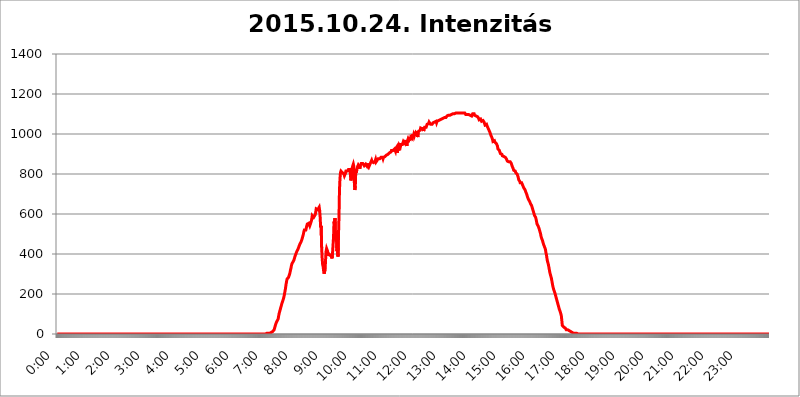
| Category | 2015.10.24. Intenzitás [W/m^2] |
|---|---|
| 0.0 | 0 |
| 0.0006944444444444445 | 0 |
| 0.001388888888888889 | 0 |
| 0.0020833333333333333 | 0 |
| 0.002777777777777778 | 0 |
| 0.003472222222222222 | 0 |
| 0.004166666666666667 | 0 |
| 0.004861111111111111 | 0 |
| 0.005555555555555556 | 0 |
| 0.0062499999999999995 | 0 |
| 0.006944444444444444 | 0 |
| 0.007638888888888889 | 0 |
| 0.008333333333333333 | 0 |
| 0.009027777777777779 | 0 |
| 0.009722222222222222 | 0 |
| 0.010416666666666666 | 0 |
| 0.011111111111111112 | 0 |
| 0.011805555555555555 | 0 |
| 0.012499999999999999 | 0 |
| 0.013194444444444444 | 0 |
| 0.013888888888888888 | 0 |
| 0.014583333333333332 | 0 |
| 0.015277777777777777 | 0 |
| 0.015972222222222224 | 0 |
| 0.016666666666666666 | 0 |
| 0.017361111111111112 | 0 |
| 0.018055555555555557 | 0 |
| 0.01875 | 0 |
| 0.019444444444444445 | 0 |
| 0.02013888888888889 | 0 |
| 0.020833333333333332 | 0 |
| 0.02152777777777778 | 0 |
| 0.022222222222222223 | 0 |
| 0.02291666666666667 | 0 |
| 0.02361111111111111 | 0 |
| 0.024305555555555556 | 0 |
| 0.024999999999999998 | 0 |
| 0.025694444444444447 | 0 |
| 0.02638888888888889 | 0 |
| 0.027083333333333334 | 0 |
| 0.027777777777777776 | 0 |
| 0.02847222222222222 | 0 |
| 0.029166666666666664 | 0 |
| 0.029861111111111113 | 0 |
| 0.030555555555555555 | 0 |
| 0.03125 | 0 |
| 0.03194444444444445 | 0 |
| 0.03263888888888889 | 0 |
| 0.03333333333333333 | 0 |
| 0.034027777777777775 | 0 |
| 0.034722222222222224 | 0 |
| 0.035416666666666666 | 0 |
| 0.036111111111111115 | 0 |
| 0.03680555555555556 | 0 |
| 0.0375 | 0 |
| 0.03819444444444444 | 0 |
| 0.03888888888888889 | 0 |
| 0.03958333333333333 | 0 |
| 0.04027777777777778 | 0 |
| 0.04097222222222222 | 0 |
| 0.041666666666666664 | 0 |
| 0.042361111111111106 | 0 |
| 0.04305555555555556 | 0 |
| 0.043750000000000004 | 0 |
| 0.044444444444444446 | 0 |
| 0.04513888888888889 | 0 |
| 0.04583333333333334 | 0 |
| 0.04652777777777778 | 0 |
| 0.04722222222222222 | 0 |
| 0.04791666666666666 | 0 |
| 0.04861111111111111 | 0 |
| 0.049305555555555554 | 0 |
| 0.049999999999999996 | 0 |
| 0.05069444444444445 | 0 |
| 0.051388888888888894 | 0 |
| 0.052083333333333336 | 0 |
| 0.05277777777777778 | 0 |
| 0.05347222222222222 | 0 |
| 0.05416666666666667 | 0 |
| 0.05486111111111111 | 0 |
| 0.05555555555555555 | 0 |
| 0.05625 | 0 |
| 0.05694444444444444 | 0 |
| 0.057638888888888885 | 0 |
| 0.05833333333333333 | 0 |
| 0.05902777777777778 | 0 |
| 0.059722222222222225 | 0 |
| 0.06041666666666667 | 0 |
| 0.061111111111111116 | 0 |
| 0.06180555555555556 | 0 |
| 0.0625 | 0 |
| 0.06319444444444444 | 0 |
| 0.06388888888888888 | 0 |
| 0.06458333333333334 | 0 |
| 0.06527777777777778 | 0 |
| 0.06597222222222222 | 0 |
| 0.06666666666666667 | 0 |
| 0.06736111111111111 | 0 |
| 0.06805555555555555 | 0 |
| 0.06874999999999999 | 0 |
| 0.06944444444444443 | 0 |
| 0.07013888888888889 | 0 |
| 0.07083333333333333 | 0 |
| 0.07152777777777779 | 0 |
| 0.07222222222222223 | 0 |
| 0.07291666666666667 | 0 |
| 0.07361111111111111 | 0 |
| 0.07430555555555556 | 0 |
| 0.075 | 0 |
| 0.07569444444444444 | 0 |
| 0.0763888888888889 | 0 |
| 0.07708333333333334 | 0 |
| 0.07777777777777778 | 0 |
| 0.07847222222222222 | 0 |
| 0.07916666666666666 | 0 |
| 0.0798611111111111 | 0 |
| 0.08055555555555556 | 0 |
| 0.08125 | 0 |
| 0.08194444444444444 | 0 |
| 0.08263888888888889 | 0 |
| 0.08333333333333333 | 0 |
| 0.08402777777777777 | 0 |
| 0.08472222222222221 | 0 |
| 0.08541666666666665 | 0 |
| 0.08611111111111112 | 0 |
| 0.08680555555555557 | 0 |
| 0.08750000000000001 | 0 |
| 0.08819444444444445 | 0 |
| 0.08888888888888889 | 0 |
| 0.08958333333333333 | 0 |
| 0.09027777777777778 | 0 |
| 0.09097222222222222 | 0 |
| 0.09166666666666667 | 0 |
| 0.09236111111111112 | 0 |
| 0.09305555555555556 | 0 |
| 0.09375 | 0 |
| 0.09444444444444444 | 0 |
| 0.09513888888888888 | 0 |
| 0.09583333333333333 | 0 |
| 0.09652777777777777 | 0 |
| 0.09722222222222222 | 0 |
| 0.09791666666666667 | 0 |
| 0.09861111111111111 | 0 |
| 0.09930555555555555 | 0 |
| 0.09999999999999999 | 0 |
| 0.10069444444444443 | 0 |
| 0.1013888888888889 | 0 |
| 0.10208333333333335 | 0 |
| 0.10277777777777779 | 0 |
| 0.10347222222222223 | 0 |
| 0.10416666666666667 | 0 |
| 0.10486111111111111 | 0 |
| 0.10555555555555556 | 0 |
| 0.10625 | 0 |
| 0.10694444444444444 | 0 |
| 0.1076388888888889 | 0 |
| 0.10833333333333334 | 0 |
| 0.10902777777777778 | 0 |
| 0.10972222222222222 | 0 |
| 0.1111111111111111 | 0 |
| 0.11180555555555556 | 0 |
| 0.11180555555555556 | 0 |
| 0.1125 | 0 |
| 0.11319444444444444 | 0 |
| 0.11388888888888889 | 0 |
| 0.11458333333333333 | 0 |
| 0.11527777777777777 | 0 |
| 0.11597222222222221 | 0 |
| 0.11666666666666665 | 0 |
| 0.1173611111111111 | 0 |
| 0.11805555555555557 | 0 |
| 0.11944444444444445 | 0 |
| 0.12013888888888889 | 0 |
| 0.12083333333333333 | 0 |
| 0.12152777777777778 | 0 |
| 0.12222222222222223 | 0 |
| 0.12291666666666667 | 0 |
| 0.12291666666666667 | 0 |
| 0.12361111111111112 | 0 |
| 0.12430555555555556 | 0 |
| 0.125 | 0 |
| 0.12569444444444444 | 0 |
| 0.12638888888888888 | 0 |
| 0.12708333333333333 | 0 |
| 0.16875 | 0 |
| 0.12847222222222224 | 0 |
| 0.12916666666666668 | 0 |
| 0.12986111111111112 | 0 |
| 0.13055555555555556 | 0 |
| 0.13125 | 0 |
| 0.13194444444444445 | 0 |
| 0.1326388888888889 | 0 |
| 0.13333333333333333 | 0 |
| 0.13402777777777777 | 0 |
| 0.13402777777777777 | 0 |
| 0.13472222222222222 | 0 |
| 0.13541666666666666 | 0 |
| 0.1361111111111111 | 0 |
| 0.13749999999999998 | 0 |
| 0.13819444444444443 | 0 |
| 0.1388888888888889 | 0 |
| 0.13958333333333334 | 0 |
| 0.14027777777777778 | 0 |
| 0.14097222222222222 | 0 |
| 0.14166666666666666 | 0 |
| 0.1423611111111111 | 0 |
| 0.14305555555555557 | 0 |
| 0.14375000000000002 | 0 |
| 0.14444444444444446 | 0 |
| 0.1451388888888889 | 0 |
| 0.1451388888888889 | 0 |
| 0.14652777777777778 | 0 |
| 0.14722222222222223 | 0 |
| 0.14791666666666667 | 0 |
| 0.1486111111111111 | 0 |
| 0.14930555555555555 | 0 |
| 0.15 | 0 |
| 0.15069444444444444 | 0 |
| 0.15138888888888888 | 0 |
| 0.15208333333333332 | 0 |
| 0.15277777777777776 | 0 |
| 0.15347222222222223 | 0 |
| 0.15416666666666667 | 0 |
| 0.15486111111111112 | 0 |
| 0.15555555555555556 | 0 |
| 0.15625 | 0 |
| 0.15694444444444444 | 0 |
| 0.15763888888888888 | 0 |
| 0.15833333333333333 | 0 |
| 0.15902777777777777 | 0 |
| 0.15972222222222224 | 0 |
| 0.16041666666666668 | 0 |
| 0.16111111111111112 | 0 |
| 0.16180555555555556 | 0 |
| 0.1625 | 0 |
| 0.16319444444444445 | 0 |
| 0.1638888888888889 | 0 |
| 0.16458333333333333 | 0 |
| 0.16527777777777777 | 0 |
| 0.16597222222222222 | 0 |
| 0.16666666666666666 | 0 |
| 0.1673611111111111 | 0 |
| 0.16805555555555554 | 0 |
| 0.16874999999999998 | 0 |
| 0.16944444444444443 | 0 |
| 0.17013888888888887 | 0 |
| 0.1708333333333333 | 0 |
| 0.17152777777777775 | 0 |
| 0.17222222222222225 | 0 |
| 0.1729166666666667 | 0 |
| 0.17361111111111113 | 0 |
| 0.17430555555555557 | 0 |
| 0.17500000000000002 | 0 |
| 0.17569444444444446 | 0 |
| 0.1763888888888889 | 0 |
| 0.17708333333333334 | 0 |
| 0.17777777777777778 | 0 |
| 0.17847222222222223 | 0 |
| 0.17916666666666667 | 0 |
| 0.1798611111111111 | 0 |
| 0.18055555555555555 | 0 |
| 0.18125 | 0 |
| 0.18194444444444444 | 0 |
| 0.1826388888888889 | 0 |
| 0.18333333333333335 | 0 |
| 0.1840277777777778 | 0 |
| 0.18472222222222223 | 0 |
| 0.18541666666666667 | 0 |
| 0.18611111111111112 | 0 |
| 0.18680555555555556 | 0 |
| 0.1875 | 0 |
| 0.18819444444444444 | 0 |
| 0.18888888888888888 | 0 |
| 0.18958333333333333 | 0 |
| 0.19027777777777777 | 0 |
| 0.1909722222222222 | 0 |
| 0.19166666666666665 | 0 |
| 0.19236111111111112 | 0 |
| 0.19305555555555554 | 0 |
| 0.19375 | 0 |
| 0.19444444444444445 | 0 |
| 0.1951388888888889 | 0 |
| 0.19583333333333333 | 0 |
| 0.19652777777777777 | 0 |
| 0.19722222222222222 | 0 |
| 0.19791666666666666 | 0 |
| 0.1986111111111111 | 0 |
| 0.19930555555555554 | 0 |
| 0.19999999999999998 | 0 |
| 0.20069444444444443 | 0 |
| 0.20138888888888887 | 0 |
| 0.2020833333333333 | 0 |
| 0.2027777777777778 | 0 |
| 0.2034722222222222 | 0 |
| 0.2041666666666667 | 0 |
| 0.20486111111111113 | 0 |
| 0.20555555555555557 | 0 |
| 0.20625000000000002 | 0 |
| 0.20694444444444446 | 0 |
| 0.2076388888888889 | 0 |
| 0.20833333333333334 | 0 |
| 0.20902777777777778 | 0 |
| 0.20972222222222223 | 0 |
| 0.21041666666666667 | 0 |
| 0.2111111111111111 | 0 |
| 0.21180555555555555 | 0 |
| 0.2125 | 0 |
| 0.21319444444444444 | 0 |
| 0.2138888888888889 | 0 |
| 0.21458333333333335 | 0 |
| 0.2152777777777778 | 0 |
| 0.21597222222222223 | 0 |
| 0.21666666666666667 | 0 |
| 0.21736111111111112 | 0 |
| 0.21805555555555556 | 0 |
| 0.21875 | 0 |
| 0.21944444444444444 | 0 |
| 0.22013888888888888 | 0 |
| 0.22083333333333333 | 0 |
| 0.22152777777777777 | 0 |
| 0.2222222222222222 | 0 |
| 0.22291666666666665 | 0 |
| 0.2236111111111111 | 0 |
| 0.22430555555555556 | 0 |
| 0.225 | 0 |
| 0.22569444444444445 | 0 |
| 0.2263888888888889 | 0 |
| 0.22708333333333333 | 0 |
| 0.22777777777777777 | 0 |
| 0.22847222222222222 | 0 |
| 0.22916666666666666 | 0 |
| 0.2298611111111111 | 0 |
| 0.23055555555555554 | 0 |
| 0.23124999999999998 | 0 |
| 0.23194444444444443 | 0 |
| 0.23263888888888887 | 0 |
| 0.2333333333333333 | 0 |
| 0.2340277777777778 | 0 |
| 0.2347222222222222 | 0 |
| 0.2354166666666667 | 0 |
| 0.23611111111111113 | 0 |
| 0.23680555555555557 | 0 |
| 0.23750000000000002 | 0 |
| 0.23819444444444446 | 0 |
| 0.2388888888888889 | 0 |
| 0.23958333333333334 | 0 |
| 0.24027777777777778 | 0 |
| 0.24097222222222223 | 0 |
| 0.24166666666666667 | 0 |
| 0.2423611111111111 | 0 |
| 0.24305555555555555 | 0 |
| 0.24375 | 0 |
| 0.24444444444444446 | 0 |
| 0.24513888888888888 | 0 |
| 0.24583333333333335 | 0 |
| 0.2465277777777778 | 0 |
| 0.24722222222222223 | 0 |
| 0.24791666666666667 | 0 |
| 0.24861111111111112 | 0 |
| 0.24930555555555556 | 0 |
| 0.25 | 0 |
| 0.25069444444444444 | 0 |
| 0.2513888888888889 | 0 |
| 0.2520833333333333 | 0 |
| 0.25277777777777777 | 0 |
| 0.2534722222222222 | 0 |
| 0.25416666666666665 | 0 |
| 0.2548611111111111 | 0 |
| 0.2555555555555556 | 0 |
| 0.25625000000000003 | 0 |
| 0.2569444444444445 | 0 |
| 0.2576388888888889 | 0 |
| 0.25833333333333336 | 0 |
| 0.2590277777777778 | 0 |
| 0.25972222222222224 | 0 |
| 0.2604166666666667 | 0 |
| 0.2611111111111111 | 0 |
| 0.26180555555555557 | 0 |
| 0.2625 | 0 |
| 0.26319444444444445 | 0 |
| 0.2638888888888889 | 0 |
| 0.26458333333333334 | 0 |
| 0.2652777777777778 | 0 |
| 0.2659722222222222 | 0 |
| 0.26666666666666666 | 0 |
| 0.2673611111111111 | 0 |
| 0.26805555555555555 | 0 |
| 0.26875 | 0 |
| 0.26944444444444443 | 0 |
| 0.2701388888888889 | 0 |
| 0.2708333333333333 | 0 |
| 0.27152777777777776 | 0 |
| 0.2722222222222222 | 0 |
| 0.27291666666666664 | 0 |
| 0.2736111111111111 | 0 |
| 0.2743055555555555 | 0 |
| 0.27499999999999997 | 0 |
| 0.27569444444444446 | 0 |
| 0.27638888888888885 | 0 |
| 0.27708333333333335 | 0 |
| 0.2777777777777778 | 0 |
| 0.27847222222222223 | 0 |
| 0.2791666666666667 | 0 |
| 0.2798611111111111 | 0 |
| 0.28055555555555556 | 0 |
| 0.28125 | 0 |
| 0.28194444444444444 | 0 |
| 0.2826388888888889 | 0 |
| 0.2833333333333333 | 0 |
| 0.28402777777777777 | 0 |
| 0.2847222222222222 | 0 |
| 0.28541666666666665 | 0 |
| 0.28611111111111115 | 0 |
| 0.28680555555555554 | 0 |
| 0.28750000000000003 | 0 |
| 0.2881944444444445 | 0 |
| 0.2888888888888889 | 0 |
| 0.28958333333333336 | 0 |
| 0.2902777777777778 | 0 |
| 0.29097222222222224 | 0 |
| 0.2916666666666667 | 0 |
| 0.2923611111111111 | 3.525 |
| 0.29305555555555557 | 3.525 |
| 0.29375 | 3.525 |
| 0.29444444444444445 | 3.525 |
| 0.2951388888888889 | 3.525 |
| 0.29583333333333334 | 3.525 |
| 0.2965277777777778 | 3.525 |
| 0.2972222222222222 | 3.525 |
| 0.29791666666666666 | 3.525 |
| 0.2986111111111111 | 7.887 |
| 0.29930555555555555 | 7.887 |
| 0.3 | 7.887 |
| 0.30069444444444443 | 12.257 |
| 0.3013888888888889 | 12.257 |
| 0.3020833333333333 | 12.257 |
| 0.30277777777777776 | 12.257 |
| 0.3034722222222222 | 16.636 |
| 0.30416666666666664 | 21.024 |
| 0.3048611111111111 | 29.823 |
| 0.3055555555555555 | 38.653 |
| 0.30624999999999997 | 47.511 |
| 0.3069444444444444 | 43.079 |
| 0.3076388888888889 | 60.85 |
| 0.30833333333333335 | 56.398 |
| 0.3090277777777778 | 60.85 |
| 0.30972222222222223 | 74.246 |
| 0.3104166666666667 | 87.692 |
| 0.3111111111111111 | 101.184 |
| 0.31180555555555556 | 110.201 |
| 0.3125 | 119.235 |
| 0.31319444444444444 | 128.284 |
| 0.3138888888888889 | 137.347 |
| 0.3145833333333333 | 146.423 |
| 0.31527777777777777 | 155.509 |
| 0.3159722222222222 | 160.056 |
| 0.31666666666666665 | 169.156 |
| 0.31736111111111115 | 178.264 |
| 0.31805555555555554 | 187.378 |
| 0.31875000000000003 | 201.058 |
| 0.3194444444444445 | 214.746 |
| 0.3201388888888889 | 228.436 |
| 0.32083333333333336 | 246.689 |
| 0.3215277777777778 | 260.373 |
| 0.32222222222222224 | 274.047 |
| 0.3229166666666667 | 274.047 |
| 0.3236111111111111 | 278.603 |
| 0.32430555555555557 | 283.156 |
| 0.325 | 287.709 |
| 0.32569444444444445 | 296.808 |
| 0.3263888888888889 | 305.898 |
| 0.32708333333333334 | 319.517 |
| 0.3277777777777778 | 328.584 |
| 0.3284722222222222 | 342.162 |
| 0.32916666666666666 | 351.198 |
| 0.3298611111111111 | 355.712 |
| 0.33055555555555555 | 360.221 |
| 0.33125 | 364.728 |
| 0.33194444444444443 | 369.23 |
| 0.3326388888888889 | 378.224 |
| 0.3333333333333333 | 387.202 |
| 0.3340277777777778 | 391.685 |
| 0.3347222222222222 | 400.638 |
| 0.3354166666666667 | 405.108 |
| 0.3361111111111111 | 414.035 |
| 0.3368055555555556 | 418.492 |
| 0.33749999999999997 | 422.943 |
| 0.33819444444444446 | 427.39 |
| 0.33888888888888885 | 436.27 |
| 0.33958333333333335 | 440.702 |
| 0.34027777777777773 | 449.551 |
| 0.34097222222222223 | 453.968 |
| 0.3416666666666666 | 458.38 |
| 0.3423611111111111 | 462.786 |
| 0.3430555555555555 | 471.582 |
| 0.34375 | 480.356 |
| 0.3444444444444445 | 484.735 |
| 0.3451388888888889 | 497.836 |
| 0.3458333333333334 | 510.885 |
| 0.34652777777777777 | 519.555 |
| 0.34722222222222227 | 523.88 |
| 0.34791666666666665 | 519.555 |
| 0.34861111111111115 | 519.555 |
| 0.34930555555555554 | 523.88 |
| 0.35000000000000003 | 541.121 |
| 0.3506944444444444 | 549.704 |
| 0.3513888888888889 | 553.986 |
| 0.3520833333333333 | 553.986 |
| 0.3527777777777778 | 553.986 |
| 0.3534722222222222 | 549.704 |
| 0.3541666666666667 | 541.121 |
| 0.3548611111111111 | 541.121 |
| 0.35555555555555557 | 545.416 |
| 0.35625 | 562.53 |
| 0.35694444444444445 | 575.299 |
| 0.3576388888888889 | 592.233 |
| 0.35833333333333334 | 596.45 |
| 0.3590277777777778 | 592.233 |
| 0.3597222222222222 | 583.779 |
| 0.36041666666666666 | 588.009 |
| 0.3611111111111111 | 588.009 |
| 0.36180555555555555 | 596.45 |
| 0.3625 | 609.062 |
| 0.36319444444444443 | 625.784 |
| 0.3638888888888889 | 629.948 |
| 0.3645833333333333 | 629.948 |
| 0.3652777777777778 | 621.613 |
| 0.3659722222222222 | 625.784 |
| 0.3666666666666667 | 625.784 |
| 0.3673611111111111 | 634.105 |
| 0.3680555555555556 | 617.436 |
| 0.36874999999999997 | 583.779 |
| 0.36944444444444446 | 532.513 |
| 0.37013888888888885 | 541.121 |
| 0.37083333333333335 | 431.833 |
| 0.37152777777777773 | 378.224 |
| 0.37222222222222223 | 346.682 |
| 0.3729166666666666 | 337.639 |
| 0.3736111111111111 | 314.98 |
| 0.3743055555555555 | 301.354 |
| 0.375 | 301.354 |
| 0.3756944444444445 | 324.052 |
| 0.3763888888888889 | 373.729 |
| 0.3770833333333334 | 414.035 |
| 0.37777777777777777 | 427.39 |
| 0.37847222222222227 | 427.39 |
| 0.37916666666666665 | 414.035 |
| 0.37986111111111115 | 391.685 |
| 0.38055555555555554 | 405.108 |
| 0.38125000000000003 | 396.164 |
| 0.3819444444444444 | 396.164 |
| 0.3826388888888889 | 396.164 |
| 0.3833333333333333 | 391.685 |
| 0.3840277777777778 | 400.638 |
| 0.3847222222222222 | 400.638 |
| 0.3854166666666667 | 378.224 |
| 0.3861111111111111 | 405.108 |
| 0.38680555555555557 | 445.129 |
| 0.3875 | 484.735 |
| 0.38819444444444445 | 562.53 |
| 0.3888888888888889 | 549.704 |
| 0.38958333333333334 | 579.542 |
| 0.3902777777777778 | 489.108 |
| 0.3909722222222222 | 462.786 |
| 0.39166666666666666 | 480.356 |
| 0.3923611111111111 | 414.035 |
| 0.39305555555555555 | 445.129 |
| 0.39375 | 387.202 |
| 0.39444444444444443 | 493.475 |
| 0.3951388888888889 | 583.779 |
| 0.3958333333333333 | 719.877 |
| 0.3965277777777778 | 775.492 |
| 0.3972222222222222 | 806.757 |
| 0.3979166666666667 | 814.519 |
| 0.3986111111111111 | 814.519 |
| 0.3993055555555556 | 814.519 |
| 0.39999999999999997 | 806.757 |
| 0.40069444444444446 | 806.757 |
| 0.40138888888888885 | 806.757 |
| 0.40208333333333335 | 798.974 |
| 0.40277777777777773 | 791.169 |
| 0.40347222222222223 | 791.169 |
| 0.4041666666666666 | 802.868 |
| 0.4048611111111111 | 814.519 |
| 0.4055555555555555 | 810.641 |
| 0.40625 | 814.519 |
| 0.4069444444444445 | 814.519 |
| 0.4076388888888889 | 818.392 |
| 0.4083333333333334 | 822.26 |
| 0.40902777777777777 | 826.123 |
| 0.40972222222222227 | 822.26 |
| 0.41041666666666665 | 822.26 |
| 0.41111111111111115 | 798.974 |
| 0.41180555555555554 | 767.62 |
| 0.41250000000000003 | 779.42 |
| 0.4131944444444444 | 822.26 |
| 0.4138888888888889 | 833.834 |
| 0.4145833333333333 | 841.526 |
| 0.4152777777777778 | 849.199 |
| 0.4159722222222222 | 837.682 |
| 0.4166666666666667 | 759.723 |
| 0.4173611111111111 | 719.877 |
| 0.41805555555555557 | 739.877 |
| 0.41875 | 822.26 |
| 0.41944444444444445 | 806.757 |
| 0.4201388888888889 | 822.26 |
| 0.42083333333333334 | 833.834 |
| 0.4215277777777778 | 837.682 |
| 0.4222222222222222 | 845.365 |
| 0.42291666666666666 | 841.526 |
| 0.4236111111111111 | 837.682 |
| 0.42430555555555555 | 826.123 |
| 0.425 | 841.526 |
| 0.42569444444444443 | 841.526 |
| 0.4263888888888889 | 853.029 |
| 0.4270833333333333 | 853.029 |
| 0.4277777777777778 | 856.855 |
| 0.4284722222222222 | 853.029 |
| 0.4291666666666667 | 856.855 |
| 0.4298611111111111 | 849.199 |
| 0.4305555555555556 | 841.526 |
| 0.43124999999999997 | 841.526 |
| 0.43194444444444446 | 845.365 |
| 0.43263888888888885 | 849.199 |
| 0.43333333333333335 | 845.365 |
| 0.43402777777777773 | 841.526 |
| 0.43472222222222223 | 853.029 |
| 0.4354166666666666 | 841.526 |
| 0.4361111111111111 | 845.365 |
| 0.4368055555555555 | 833.834 |
| 0.4375 | 837.682 |
| 0.4381944444444445 | 845.365 |
| 0.4388888888888889 | 849.199 |
| 0.4395833333333334 | 856.855 |
| 0.44027777777777777 | 856.855 |
| 0.44097222222222227 | 868.305 |
| 0.44166666666666665 | 860.676 |
| 0.44236111111111115 | 860.676 |
| 0.44305555555555554 | 864.493 |
| 0.44375000000000003 | 856.855 |
| 0.4444444444444444 | 856.855 |
| 0.4451388888888889 | 860.676 |
| 0.4458333333333333 | 864.493 |
| 0.4465277777777778 | 872.114 |
| 0.4472222222222222 | 860.676 |
| 0.4479166666666667 | 864.493 |
| 0.4486111111111111 | 868.305 |
| 0.44930555555555557 | 872.114 |
| 0.45 | 875.918 |
| 0.45069444444444445 | 872.114 |
| 0.4513888888888889 | 879.719 |
| 0.45208333333333334 | 875.918 |
| 0.4527777777777778 | 879.719 |
| 0.4534722222222222 | 879.719 |
| 0.45416666666666666 | 883.516 |
| 0.4548611111111111 | 883.516 |
| 0.45555555555555555 | 883.516 |
| 0.45625 | 883.516 |
| 0.45694444444444443 | 875.918 |
| 0.4576388888888889 | 883.516 |
| 0.4583333333333333 | 883.516 |
| 0.4590277777777778 | 887.309 |
| 0.4597222222222222 | 887.309 |
| 0.4604166666666667 | 887.309 |
| 0.4611111111111111 | 891.099 |
| 0.4618055555555556 | 894.885 |
| 0.46249999999999997 | 894.885 |
| 0.46319444444444446 | 894.885 |
| 0.46388888888888885 | 898.668 |
| 0.46458333333333335 | 902.447 |
| 0.46527777777777773 | 902.447 |
| 0.46597222222222223 | 906.223 |
| 0.4666666666666666 | 906.223 |
| 0.4673611111111111 | 909.996 |
| 0.4680555555555555 | 909.996 |
| 0.46875 | 917.534 |
| 0.4694444444444445 | 917.534 |
| 0.4701388888888889 | 917.534 |
| 0.4708333333333334 | 917.534 |
| 0.47152777777777777 | 917.534 |
| 0.47222222222222227 | 917.534 |
| 0.47291666666666665 | 925.06 |
| 0.47361111111111115 | 928.819 |
| 0.47430555555555554 | 913.766 |
| 0.47500000000000003 | 928.819 |
| 0.4756944444444444 | 925.06 |
| 0.4763888888888889 | 936.33 |
| 0.4770833333333333 | 906.223 |
| 0.4777777777777778 | 928.819 |
| 0.4784722222222222 | 925.06 |
| 0.4791666666666667 | 917.534 |
| 0.4798611111111111 | 943.832 |
| 0.48055555555555557 | 947.58 |
| 0.48125 | 936.33 |
| 0.48194444444444445 | 947.58 |
| 0.4826388888888889 | 951.327 |
| 0.48333333333333334 | 943.832 |
| 0.4840277777777778 | 947.58 |
| 0.4847222222222222 | 955.071 |
| 0.48541666666666666 | 962.555 |
| 0.4861111111111111 | 958.814 |
| 0.48680555555555555 | 955.071 |
| 0.4875 | 958.814 |
| 0.48819444444444443 | 962.555 |
| 0.4888888888888889 | 970.034 |
| 0.4895833333333333 | 966.295 |
| 0.4902777777777778 | 940.082 |
| 0.4909722222222222 | 962.555 |
| 0.4916666666666667 | 970.034 |
| 0.4923611111111111 | 958.814 |
| 0.4930555555555556 | 977.508 |
| 0.49374999999999997 | 977.508 |
| 0.49444444444444446 | 977.508 |
| 0.49513888888888885 | 973.772 |
| 0.49583333333333335 | 984.98 |
| 0.49652777777777773 | 981.244 |
| 0.49722222222222223 | 984.98 |
| 0.4979166666666666 | 977.508 |
| 0.4986111111111111 | 999.916 |
| 0.4993055555555555 | 984.98 |
| 0.5 | 996.182 |
| 0.5006944444444444 | 988.714 |
| 0.5013888888888889 | 996.182 |
| 0.5020833333333333 | 999.916 |
| 0.5027777777777778 | 1007.383 |
| 0.5034722222222222 | 1007.383 |
| 0.5041666666666667 | 999.916 |
| 0.5048611111111111 | 1014.852 |
| 0.5055555555555555 | 984.98 |
| 0.50625 | 1007.383 |
| 0.5069444444444444 | 1014.852 |
| 0.5076388888888889 | 1014.852 |
| 0.5083333333333333 | 1014.852 |
| 0.5090277777777777 | 1018.587 |
| 0.5097222222222222 | 1029.798 |
| 0.5104166666666666 | 1029.798 |
| 0.5111111111111112 | 1026.06 |
| 0.5118055555555555 | 1026.06 |
| 0.5125000000000001 | 1018.587 |
| 0.5131944444444444 | 1033.537 |
| 0.513888888888889 | 1014.852 |
| 0.5145833333333333 | 1022.323 |
| 0.5152777777777778 | 1033.537 |
| 0.5159722222222222 | 1033.537 |
| 0.5166666666666667 | 1033.537 |
| 0.517361111111111 | 1033.537 |
| 0.5180555555555556 | 1033.537 |
| 0.5187499999999999 | 1048.508 |
| 0.5194444444444445 | 1044.762 |
| 0.5201388888888888 | 1052.255 |
| 0.5208333333333334 | 1052.255 |
| 0.5215277777777778 | 1059.756 |
| 0.5222222222222223 | 1056.004 |
| 0.5229166666666667 | 1056.004 |
| 0.5236111111111111 | 1048.508 |
| 0.5243055555555556 | 1052.255 |
| 0.525 | 1052.255 |
| 0.5256944444444445 | 1048.508 |
| 0.5263888888888889 | 1052.255 |
| 0.5270833333333333 | 1056.004 |
| 0.5277777777777778 | 1059.756 |
| 0.5284722222222222 | 1059.756 |
| 0.5291666666666667 | 1059.756 |
| 0.5298611111111111 | 1063.51 |
| 0.5305555555555556 | 1063.51 |
| 0.53125 | 1063.51 |
| 0.5319444444444444 | 1056.004 |
| 0.5326388888888889 | 1063.51 |
| 0.5333333333333333 | 1067.267 |
| 0.5340277777777778 | 1067.267 |
| 0.5347222222222222 | 1067.267 |
| 0.5354166666666667 | 1071.027 |
| 0.5361111111111111 | 1071.027 |
| 0.5368055555555555 | 1071.027 |
| 0.5375 | 1071.027 |
| 0.5381944444444444 | 1074.789 |
| 0.5388888888888889 | 1074.789 |
| 0.5395833333333333 | 1074.789 |
| 0.5402777777777777 | 1078.555 |
| 0.5409722222222222 | 1078.555 |
| 0.5416666666666666 | 1078.555 |
| 0.5423611111111112 | 1082.324 |
| 0.5430555555555555 | 1082.324 |
| 0.5437500000000001 | 1078.555 |
| 0.5444444444444444 | 1086.097 |
| 0.545138888888889 | 1082.324 |
| 0.5458333333333333 | 1082.324 |
| 0.5465277777777778 | 1089.873 |
| 0.5472222222222222 | 1089.873 |
| 0.5479166666666667 | 1089.873 |
| 0.548611111111111 | 1093.653 |
| 0.5493055555555556 | 1097.437 |
| 0.5499999999999999 | 1097.437 |
| 0.5506944444444445 | 1093.653 |
| 0.5513888888888888 | 1097.437 |
| 0.5520833333333334 | 1097.437 |
| 0.5527777777777778 | 1097.437 |
| 0.5534722222222223 | 1097.437 |
| 0.5541666666666667 | 1101.226 |
| 0.5548611111111111 | 1101.226 |
| 0.5555555555555556 | 1101.226 |
| 0.55625 | 1101.226 |
| 0.5569444444444445 | 1101.226 |
| 0.5576388888888889 | 1101.226 |
| 0.5583333333333333 | 1105.019 |
| 0.5590277777777778 | 1105.019 |
| 0.5597222222222222 | 1108.816 |
| 0.5604166666666667 | 1105.019 |
| 0.5611111111111111 | 1105.019 |
| 0.5618055555555556 | 1105.019 |
| 0.5625 | 1105.019 |
| 0.5631944444444444 | 1105.019 |
| 0.5638888888888889 | 1105.019 |
| 0.5645833333333333 | 1105.019 |
| 0.5652777777777778 | 1105.019 |
| 0.5659722222222222 | 1101.226 |
| 0.5666666666666667 | 1101.226 |
| 0.5673611111111111 | 1105.019 |
| 0.5680555555555555 | 1105.019 |
| 0.56875 | 1105.019 |
| 0.5694444444444444 | 1105.019 |
| 0.5701388888888889 | 1105.019 |
| 0.5708333333333333 | 1105.019 |
| 0.5715277777777777 | 1105.019 |
| 0.5722222222222222 | 1101.226 |
| 0.5729166666666666 | 1097.437 |
| 0.5736111111111112 | 1097.437 |
| 0.5743055555555555 | 1101.226 |
| 0.5750000000000001 | 1097.437 |
| 0.5756944444444444 | 1097.437 |
| 0.576388888888889 | 1097.437 |
| 0.5770833333333333 | 1097.437 |
| 0.5777777777777778 | 1097.437 |
| 0.5784722222222222 | 1097.437 |
| 0.5791666666666667 | 1093.653 |
| 0.579861111111111 | 1097.437 |
| 0.5805555555555556 | 1089.873 |
| 0.5812499999999999 | 1089.873 |
| 0.5819444444444445 | 1093.653 |
| 0.5826388888888888 | 1101.226 |
| 0.5833333333333334 | 1097.437 |
| 0.5840277777777778 | 1101.226 |
| 0.5847222222222223 | 1101.226 |
| 0.5854166666666667 | 1093.653 |
| 0.5861111111111111 | 1093.653 |
| 0.5868055555555556 | 1093.653 |
| 0.5875 | 1089.873 |
| 0.5881944444444445 | 1086.097 |
| 0.5888888888888889 | 1086.097 |
| 0.5895833333333333 | 1086.097 |
| 0.5902777777777778 | 1082.324 |
| 0.5909722222222222 | 1078.555 |
| 0.5916666666666667 | 1071.027 |
| 0.5923611111111111 | 1067.267 |
| 0.5930555555555556 | 1074.789 |
| 0.59375 | 1074.789 |
| 0.5944444444444444 | 1071.027 |
| 0.5951388888888889 | 1063.51 |
| 0.5958333333333333 | 1059.756 |
| 0.5965277777777778 | 1063.51 |
| 0.5972222222222222 | 1067.267 |
| 0.5979166666666667 | 1067.267 |
| 0.5986111111111111 | 1059.756 |
| 0.5993055555555555 | 1059.756 |
| 0.6 | 1044.762 |
| 0.6006944444444444 | 1041.019 |
| 0.6013888888888889 | 1044.762 |
| 0.6020833333333333 | 1048.508 |
| 0.6027777777777777 | 1041.019 |
| 0.6034722222222222 | 1037.277 |
| 0.6041666666666666 | 1029.798 |
| 0.6048611111111112 | 1026.06 |
| 0.6055555555555555 | 1018.587 |
| 0.6062500000000001 | 1014.852 |
| 0.6069444444444444 | 1007.383 |
| 0.607638888888889 | 1007.383 |
| 0.6083333333333333 | 992.448 |
| 0.6090277777777778 | 992.448 |
| 0.6097222222222222 | 981.244 |
| 0.6104166666666667 | 973.772 |
| 0.611111111111111 | 962.555 |
| 0.6118055555555556 | 962.555 |
| 0.6124999999999999 | 962.555 |
| 0.6131944444444445 | 966.295 |
| 0.6138888888888888 | 958.814 |
| 0.6145833333333334 | 958.814 |
| 0.6152777777777778 | 955.071 |
| 0.6159722222222223 | 951.327 |
| 0.6166666666666667 | 947.58 |
| 0.6173611111111111 | 940.082 |
| 0.6180555555555556 | 925.06 |
| 0.61875 | 925.06 |
| 0.6194444444444445 | 921.298 |
| 0.6201388888888889 | 917.534 |
| 0.6208333333333333 | 909.996 |
| 0.6215277777777778 | 902.447 |
| 0.6222222222222222 | 902.447 |
| 0.6229166666666667 | 902.447 |
| 0.6236111111111111 | 898.668 |
| 0.6243055555555556 | 891.099 |
| 0.625 | 887.309 |
| 0.6256944444444444 | 887.309 |
| 0.6263888888888889 | 887.309 |
| 0.6270833333333333 | 887.309 |
| 0.6277777777777778 | 887.309 |
| 0.6284722222222222 | 883.516 |
| 0.6291666666666667 | 883.516 |
| 0.6298611111111111 | 875.918 |
| 0.6305555555555555 | 872.114 |
| 0.63125 | 864.493 |
| 0.6319444444444444 | 864.493 |
| 0.6326388888888889 | 860.676 |
| 0.6333333333333333 | 860.676 |
| 0.6340277777777777 | 860.676 |
| 0.6347222222222222 | 860.676 |
| 0.6354166666666666 | 860.676 |
| 0.6361111111111112 | 860.676 |
| 0.6368055555555555 | 853.029 |
| 0.6375000000000001 | 849.199 |
| 0.6381944444444444 | 837.682 |
| 0.638888888888889 | 833.834 |
| 0.6395833333333333 | 826.123 |
| 0.6402777777777778 | 818.392 |
| 0.6409722222222222 | 818.392 |
| 0.6416666666666667 | 814.519 |
| 0.642361111111111 | 814.519 |
| 0.6430555555555556 | 806.757 |
| 0.6437499999999999 | 806.757 |
| 0.6444444444444445 | 802.868 |
| 0.6451388888888888 | 798.974 |
| 0.6458333333333334 | 791.169 |
| 0.6465277777777778 | 783.342 |
| 0.6472222222222223 | 771.559 |
| 0.6479166666666667 | 767.62 |
| 0.6486111111111111 | 763.674 |
| 0.6493055555555556 | 755.766 |
| 0.65 | 755.766 |
| 0.6506944444444445 | 755.766 |
| 0.6513888888888889 | 755.766 |
| 0.6520833333333333 | 751.803 |
| 0.6527777777777778 | 743.859 |
| 0.6534722222222222 | 743.859 |
| 0.6541666666666667 | 731.896 |
| 0.6548611111111111 | 731.896 |
| 0.6555555555555556 | 727.896 |
| 0.65625 | 719.877 |
| 0.6569444444444444 | 711.832 |
| 0.6576388888888889 | 707.8 |
| 0.6583333333333333 | 699.717 |
| 0.6590277777777778 | 695.666 |
| 0.6597222222222222 | 683.473 |
| 0.6604166666666667 | 679.395 |
| 0.6611111111111111 | 671.22 |
| 0.6618055555555555 | 667.123 |
| 0.6625 | 663.019 |
| 0.6631944444444444 | 658.909 |
| 0.6638888888888889 | 650.667 |
| 0.6645833333333333 | 646.537 |
| 0.6652777777777777 | 642.4 |
| 0.6659722222222222 | 634.105 |
| 0.6666666666666666 | 625.784 |
| 0.6673611111111111 | 617.436 |
| 0.6680555555555556 | 613.252 |
| 0.6687500000000001 | 600.661 |
| 0.6694444444444444 | 592.233 |
| 0.6701388888888888 | 592.233 |
| 0.6708333333333334 | 583.779 |
| 0.6715277777777778 | 575.299 |
| 0.6722222222222222 | 562.53 |
| 0.6729166666666666 | 549.704 |
| 0.6736111111111112 | 545.416 |
| 0.6743055555555556 | 541.121 |
| 0.6749999999999999 | 536.82 |
| 0.6756944444444444 | 528.2 |
| 0.6763888888888889 | 519.555 |
| 0.6770833333333334 | 515.223 |
| 0.6777777777777777 | 502.192 |
| 0.6784722222222223 | 489.108 |
| 0.6791666666666667 | 480.356 |
| 0.6798611111111111 | 475.972 |
| 0.6805555555555555 | 467.187 |
| 0.68125 | 462.786 |
| 0.6819444444444445 | 449.551 |
| 0.6826388888888889 | 445.129 |
| 0.6833333333333332 | 436.27 |
| 0.6840277777777778 | 431.833 |
| 0.6847222222222222 | 422.943 |
| 0.6854166666666667 | 405.108 |
| 0.686111111111111 | 396.164 |
| 0.6868055555555556 | 378.224 |
| 0.6875 | 364.728 |
| 0.6881944444444444 | 355.712 |
| 0.688888888888889 | 346.682 |
| 0.6895833333333333 | 333.113 |
| 0.6902777777777778 | 319.517 |
| 0.6909722222222222 | 305.898 |
| 0.6916666666666668 | 301.354 |
| 0.6923611111111111 | 287.709 |
| 0.6930555555555555 | 278.603 |
| 0.69375 | 264.932 |
| 0.6944444444444445 | 251.251 |
| 0.6951388888888889 | 237.564 |
| 0.6958333333333333 | 228.436 |
| 0.6965277777777777 | 219.309 |
| 0.6972222222222223 | 214.746 |
| 0.6979166666666666 | 205.62 |
| 0.6986111111111111 | 196.497 |
| 0.6993055555555556 | 187.378 |
| 0.7000000000000001 | 178.264 |
| 0.7006944444444444 | 169.156 |
| 0.7013888888888888 | 160.056 |
| 0.7020833333333334 | 150.964 |
| 0.7027777777777778 | 141.884 |
| 0.7034722222222222 | 132.814 |
| 0.7041666666666666 | 123.758 |
| 0.7048611111111112 | 119.235 |
| 0.7055555555555556 | 110.201 |
| 0.7062499999999999 | 105.69 |
| 0.7069444444444444 | 92.184 |
| 0.7076388888888889 | 69.775 |
| 0.7083333333333334 | 43.079 |
| 0.7090277777777777 | 38.653 |
| 0.7097222222222223 | 38.653 |
| 0.7104166666666667 | 34.234 |
| 0.7111111111111111 | 34.234 |
| 0.7118055555555555 | 29.823 |
| 0.7125 | 29.823 |
| 0.7131944444444445 | 25.419 |
| 0.7138888888888889 | 21.024 |
| 0.7145833333333332 | 21.024 |
| 0.7152777777777778 | 21.024 |
| 0.7159722222222222 | 21.024 |
| 0.7166666666666667 | 21.024 |
| 0.717361111111111 | 16.636 |
| 0.7180555555555556 | 16.636 |
| 0.71875 | 16.636 |
| 0.7194444444444444 | 12.257 |
| 0.720138888888889 | 12.257 |
| 0.7208333333333333 | 12.257 |
| 0.7215277777777778 | 12.257 |
| 0.7222222222222222 | 7.887 |
| 0.7229166666666668 | 7.887 |
| 0.7236111111111111 | 7.887 |
| 0.7243055555555555 | 3.525 |
| 0.725 | 3.525 |
| 0.7256944444444445 | 3.525 |
| 0.7263888888888889 | 3.525 |
| 0.7270833333333333 | 3.525 |
| 0.7277777777777777 | 3.525 |
| 0.7284722222222223 | 3.525 |
| 0.7291666666666666 | 3.525 |
| 0.7298611111111111 | 3.525 |
| 0.7305555555555556 | 0 |
| 0.7312500000000001 | 0 |
| 0.7319444444444444 | 0 |
| 0.7326388888888888 | 0 |
| 0.7333333333333334 | 0 |
| 0.7340277777777778 | 0 |
| 0.7347222222222222 | 0 |
| 0.7354166666666666 | 0 |
| 0.7361111111111112 | 0 |
| 0.7368055555555556 | 0 |
| 0.7374999999999999 | 0 |
| 0.7381944444444444 | 0 |
| 0.7388888888888889 | 0 |
| 0.7395833333333334 | 0 |
| 0.7402777777777777 | 0 |
| 0.7409722222222223 | 0 |
| 0.7416666666666667 | 0 |
| 0.7423611111111111 | 0 |
| 0.7430555555555555 | 0 |
| 0.74375 | 0 |
| 0.7444444444444445 | 0 |
| 0.7451388888888889 | 0 |
| 0.7458333333333332 | 0 |
| 0.7465277777777778 | 0 |
| 0.7472222222222222 | 0 |
| 0.7479166666666667 | 0 |
| 0.748611111111111 | 0 |
| 0.7493055555555556 | 0 |
| 0.75 | 0 |
| 0.7506944444444444 | 0 |
| 0.751388888888889 | 0 |
| 0.7520833333333333 | 0 |
| 0.7527777777777778 | 0 |
| 0.7534722222222222 | 0 |
| 0.7541666666666668 | 0 |
| 0.7548611111111111 | 0 |
| 0.7555555555555555 | 0 |
| 0.75625 | 0 |
| 0.7569444444444445 | 0 |
| 0.7576388888888889 | 0 |
| 0.7583333333333333 | 0 |
| 0.7590277777777777 | 0 |
| 0.7597222222222223 | 0 |
| 0.7604166666666666 | 0 |
| 0.7611111111111111 | 0 |
| 0.7618055555555556 | 0 |
| 0.7625000000000001 | 0 |
| 0.7631944444444444 | 0 |
| 0.7638888888888888 | 0 |
| 0.7645833333333334 | 0 |
| 0.7652777777777778 | 0 |
| 0.7659722222222222 | 0 |
| 0.7666666666666666 | 0 |
| 0.7673611111111112 | 0 |
| 0.7680555555555556 | 0 |
| 0.7687499999999999 | 0 |
| 0.7694444444444444 | 0 |
| 0.7701388888888889 | 0 |
| 0.7708333333333334 | 0 |
| 0.7715277777777777 | 0 |
| 0.7722222222222223 | 0 |
| 0.7729166666666667 | 0 |
| 0.7736111111111111 | 0 |
| 0.7743055555555555 | 0 |
| 0.775 | 0 |
| 0.7756944444444445 | 0 |
| 0.7763888888888889 | 0 |
| 0.7770833333333332 | 0 |
| 0.7777777777777778 | 0 |
| 0.7784722222222222 | 0 |
| 0.7791666666666667 | 0 |
| 0.779861111111111 | 0 |
| 0.7805555555555556 | 0 |
| 0.78125 | 0 |
| 0.7819444444444444 | 0 |
| 0.782638888888889 | 0 |
| 0.7833333333333333 | 0 |
| 0.7840277777777778 | 0 |
| 0.7847222222222222 | 0 |
| 0.7854166666666668 | 0 |
| 0.7861111111111111 | 0 |
| 0.7868055555555555 | 0 |
| 0.7875 | 0 |
| 0.7881944444444445 | 0 |
| 0.7888888888888889 | 0 |
| 0.7895833333333333 | 0 |
| 0.7902777777777777 | 0 |
| 0.7909722222222223 | 0 |
| 0.7916666666666666 | 0 |
| 0.7923611111111111 | 0 |
| 0.7930555555555556 | 0 |
| 0.7937500000000001 | 0 |
| 0.7944444444444444 | 0 |
| 0.7951388888888888 | 0 |
| 0.7958333333333334 | 0 |
| 0.7965277777777778 | 0 |
| 0.7972222222222222 | 0 |
| 0.7979166666666666 | 0 |
| 0.7986111111111112 | 0 |
| 0.7993055555555556 | 0 |
| 0.7999999999999999 | 0 |
| 0.8006944444444444 | 0 |
| 0.8013888888888889 | 0 |
| 0.8020833333333334 | 0 |
| 0.8027777777777777 | 0 |
| 0.8034722222222223 | 0 |
| 0.8041666666666667 | 0 |
| 0.8048611111111111 | 0 |
| 0.8055555555555555 | 0 |
| 0.80625 | 0 |
| 0.8069444444444445 | 0 |
| 0.8076388888888889 | 0 |
| 0.8083333333333332 | 0 |
| 0.8090277777777778 | 0 |
| 0.8097222222222222 | 0 |
| 0.8104166666666667 | 0 |
| 0.811111111111111 | 0 |
| 0.8118055555555556 | 0 |
| 0.8125 | 0 |
| 0.8131944444444444 | 0 |
| 0.813888888888889 | 0 |
| 0.8145833333333333 | 0 |
| 0.8152777777777778 | 0 |
| 0.8159722222222222 | 0 |
| 0.8166666666666668 | 0 |
| 0.8173611111111111 | 0 |
| 0.8180555555555555 | 0 |
| 0.81875 | 0 |
| 0.8194444444444445 | 0 |
| 0.8201388888888889 | 0 |
| 0.8208333333333333 | 0 |
| 0.8215277777777777 | 0 |
| 0.8222222222222223 | 0 |
| 0.8229166666666666 | 0 |
| 0.8236111111111111 | 0 |
| 0.8243055555555556 | 0 |
| 0.8250000000000001 | 0 |
| 0.8256944444444444 | 0 |
| 0.8263888888888888 | 0 |
| 0.8270833333333334 | 0 |
| 0.8277777777777778 | 0 |
| 0.8284722222222222 | 0 |
| 0.8291666666666666 | 0 |
| 0.8298611111111112 | 0 |
| 0.8305555555555556 | 0 |
| 0.8312499999999999 | 0 |
| 0.8319444444444444 | 0 |
| 0.8326388888888889 | 0 |
| 0.8333333333333334 | 0 |
| 0.8340277777777777 | 0 |
| 0.8347222222222223 | 0 |
| 0.8354166666666667 | 0 |
| 0.8361111111111111 | 0 |
| 0.8368055555555555 | 0 |
| 0.8375 | 0 |
| 0.8381944444444445 | 0 |
| 0.8388888888888889 | 0 |
| 0.8395833333333332 | 0 |
| 0.8402777777777778 | 0 |
| 0.8409722222222222 | 0 |
| 0.8416666666666667 | 0 |
| 0.842361111111111 | 0 |
| 0.8430555555555556 | 0 |
| 0.84375 | 0 |
| 0.8444444444444444 | 0 |
| 0.845138888888889 | 0 |
| 0.8458333333333333 | 0 |
| 0.8465277777777778 | 0 |
| 0.8472222222222222 | 0 |
| 0.8479166666666668 | 0 |
| 0.8486111111111111 | 0 |
| 0.8493055555555555 | 0 |
| 0.85 | 0 |
| 0.8506944444444445 | 0 |
| 0.8513888888888889 | 0 |
| 0.8520833333333333 | 0 |
| 0.8527777777777777 | 0 |
| 0.8534722222222223 | 0 |
| 0.8541666666666666 | 0 |
| 0.8548611111111111 | 0 |
| 0.8555555555555556 | 0 |
| 0.8562500000000001 | 0 |
| 0.8569444444444444 | 0 |
| 0.8576388888888888 | 0 |
| 0.8583333333333334 | 0 |
| 0.8590277777777778 | 0 |
| 0.8597222222222222 | 0 |
| 0.8604166666666666 | 0 |
| 0.8611111111111112 | 0 |
| 0.8618055555555556 | 0 |
| 0.8624999999999999 | 0 |
| 0.8631944444444444 | 0 |
| 0.8638888888888889 | 0 |
| 0.8645833333333334 | 0 |
| 0.8652777777777777 | 0 |
| 0.8659722222222223 | 0 |
| 0.8666666666666667 | 0 |
| 0.8673611111111111 | 0 |
| 0.8680555555555555 | 0 |
| 0.86875 | 0 |
| 0.8694444444444445 | 0 |
| 0.8701388888888889 | 0 |
| 0.8708333333333332 | 0 |
| 0.8715277777777778 | 0 |
| 0.8722222222222222 | 0 |
| 0.8729166666666667 | 0 |
| 0.873611111111111 | 0 |
| 0.8743055555555556 | 0 |
| 0.875 | 0 |
| 0.8756944444444444 | 0 |
| 0.876388888888889 | 0 |
| 0.8770833333333333 | 0 |
| 0.8777777777777778 | 0 |
| 0.8784722222222222 | 0 |
| 0.8791666666666668 | 0 |
| 0.8798611111111111 | 0 |
| 0.8805555555555555 | 0 |
| 0.88125 | 0 |
| 0.8819444444444445 | 0 |
| 0.8826388888888889 | 0 |
| 0.8833333333333333 | 0 |
| 0.8840277777777777 | 0 |
| 0.8847222222222223 | 0 |
| 0.8854166666666666 | 0 |
| 0.8861111111111111 | 0 |
| 0.8868055555555556 | 0 |
| 0.8875000000000001 | 0 |
| 0.8881944444444444 | 0 |
| 0.8888888888888888 | 0 |
| 0.8895833333333334 | 0 |
| 0.8902777777777778 | 0 |
| 0.8909722222222222 | 0 |
| 0.8916666666666666 | 0 |
| 0.8923611111111112 | 0 |
| 0.8930555555555556 | 0 |
| 0.8937499999999999 | 0 |
| 0.8944444444444444 | 0 |
| 0.8951388888888889 | 0 |
| 0.8958333333333334 | 0 |
| 0.8965277777777777 | 0 |
| 0.8972222222222223 | 0 |
| 0.8979166666666667 | 0 |
| 0.8986111111111111 | 0 |
| 0.8993055555555555 | 0 |
| 0.9 | 0 |
| 0.9006944444444445 | 0 |
| 0.9013888888888889 | 0 |
| 0.9020833333333332 | 0 |
| 0.9027777777777778 | 0 |
| 0.9034722222222222 | 0 |
| 0.9041666666666667 | 0 |
| 0.904861111111111 | 0 |
| 0.9055555555555556 | 0 |
| 0.90625 | 0 |
| 0.9069444444444444 | 0 |
| 0.907638888888889 | 0 |
| 0.9083333333333333 | 0 |
| 0.9090277777777778 | 0 |
| 0.9097222222222222 | 0 |
| 0.9104166666666668 | 0 |
| 0.9111111111111111 | 0 |
| 0.9118055555555555 | 0 |
| 0.9125 | 0 |
| 0.9131944444444445 | 0 |
| 0.9138888888888889 | 0 |
| 0.9145833333333333 | 0 |
| 0.9152777777777777 | 0 |
| 0.9159722222222223 | 0 |
| 0.9166666666666666 | 0 |
| 0.9173611111111111 | 0 |
| 0.9180555555555556 | 0 |
| 0.9187500000000001 | 0 |
| 0.9194444444444444 | 0 |
| 0.9201388888888888 | 0 |
| 0.9208333333333334 | 0 |
| 0.9215277777777778 | 0 |
| 0.9222222222222222 | 0 |
| 0.9229166666666666 | 0 |
| 0.9236111111111112 | 0 |
| 0.9243055555555556 | 0 |
| 0.9249999999999999 | 0 |
| 0.9256944444444444 | 0 |
| 0.9263888888888889 | 0 |
| 0.9270833333333334 | 0 |
| 0.9277777777777777 | 0 |
| 0.9284722222222223 | 0 |
| 0.9291666666666667 | 0 |
| 0.9298611111111111 | 0 |
| 0.9305555555555555 | 0 |
| 0.93125 | 0 |
| 0.9319444444444445 | 0 |
| 0.9326388888888889 | 0 |
| 0.9333333333333332 | 0 |
| 0.9340277777777778 | 0 |
| 0.9347222222222222 | 0 |
| 0.9354166666666667 | 0 |
| 0.936111111111111 | 0 |
| 0.9368055555555556 | 0 |
| 0.9375 | 0 |
| 0.9381944444444444 | 0 |
| 0.938888888888889 | 0 |
| 0.9395833333333333 | 0 |
| 0.9402777777777778 | 0 |
| 0.9409722222222222 | 0 |
| 0.9416666666666668 | 0 |
| 0.9423611111111111 | 0 |
| 0.9430555555555555 | 0 |
| 0.94375 | 0 |
| 0.9444444444444445 | 0 |
| 0.9451388888888889 | 0 |
| 0.9458333333333333 | 0 |
| 0.9465277777777777 | 0 |
| 0.9472222222222223 | 0 |
| 0.9479166666666666 | 0 |
| 0.9486111111111111 | 0 |
| 0.9493055555555556 | 0 |
| 0.9500000000000001 | 0 |
| 0.9506944444444444 | 0 |
| 0.9513888888888888 | 0 |
| 0.9520833333333334 | 0 |
| 0.9527777777777778 | 0 |
| 0.9534722222222222 | 0 |
| 0.9541666666666666 | 0 |
| 0.9548611111111112 | 0 |
| 0.9555555555555556 | 0 |
| 0.9562499999999999 | 0 |
| 0.9569444444444444 | 0 |
| 0.9576388888888889 | 0 |
| 0.9583333333333334 | 0 |
| 0.9590277777777777 | 0 |
| 0.9597222222222223 | 0 |
| 0.9604166666666667 | 0 |
| 0.9611111111111111 | 0 |
| 0.9618055555555555 | 0 |
| 0.9625 | 0 |
| 0.9631944444444445 | 0 |
| 0.9638888888888889 | 0 |
| 0.9645833333333332 | 0 |
| 0.9652777777777778 | 0 |
| 0.9659722222222222 | 0 |
| 0.9666666666666667 | 0 |
| 0.967361111111111 | 0 |
| 0.9680555555555556 | 0 |
| 0.96875 | 0 |
| 0.9694444444444444 | 0 |
| 0.970138888888889 | 0 |
| 0.9708333333333333 | 0 |
| 0.9715277777777778 | 0 |
| 0.9722222222222222 | 0 |
| 0.9729166666666668 | 0 |
| 0.9736111111111111 | 0 |
| 0.9743055555555555 | 0 |
| 0.975 | 0 |
| 0.9756944444444445 | 0 |
| 0.9763888888888889 | 0 |
| 0.9770833333333333 | 0 |
| 0.9777777777777777 | 0 |
| 0.9784722222222223 | 0 |
| 0.9791666666666666 | 0 |
| 0.9798611111111111 | 0 |
| 0.9805555555555556 | 0 |
| 0.9812500000000001 | 0 |
| 0.9819444444444444 | 0 |
| 0.9826388888888888 | 0 |
| 0.9833333333333334 | 0 |
| 0.9840277777777778 | 0 |
| 0.9847222222222222 | 0 |
| 0.9854166666666666 | 0 |
| 0.9861111111111112 | 0 |
| 0.9868055555555556 | 0 |
| 0.9874999999999999 | 0 |
| 0.9881944444444444 | 0 |
| 0.9888888888888889 | 0 |
| 0.9895833333333334 | 0 |
| 0.9902777777777777 | 0 |
| 0.9909722222222223 | 0 |
| 0.9916666666666667 | 0 |
| 0.9923611111111111 | 0 |
| 0.9930555555555555 | 0 |
| 0.99375 | 0 |
| 0.9944444444444445 | 0 |
| 0.9951388888888889 | 0 |
| 0.9958333333333332 | 0 |
| 0.9965277777777778 | 0 |
| 0.9972222222222222 | 0 |
| 0.9979166666666667 | 0 |
| 0.998611111111111 | 0 |
| 0.9993055555555556 | 0 |